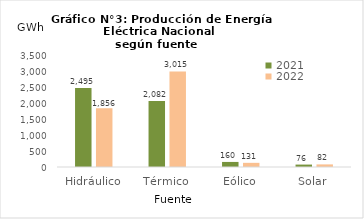
| Category | 2021 | 2022 |
|---|---|---|
| Hidráulico | 2494.63 | 1856.41 |
| Térmico | 2081.994 | 3014.986 |
| Eólico | 159.717 | 131.262 |
| Solar | 76.402 | 81.91 |